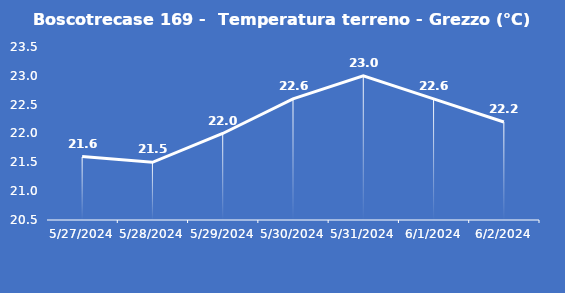
| Category | Boscotrecase 169 -  Temperatura terreno - Grezzo (°C) |
|---|---|
| 5/27/24 | 21.6 |
| 5/28/24 | 21.5 |
| 5/29/24 | 22 |
| 5/30/24 | 22.6 |
| 5/31/24 | 23 |
| 6/1/24 | 22.6 |
| 6/2/24 | 22.2 |